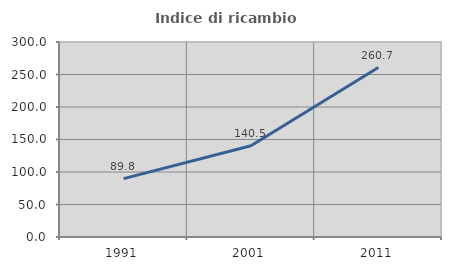
| Category | Indice di ricambio occupazionale  |
|---|---|
| 1991.0 | 89.762 |
| 2001.0 | 140.455 |
| 2011.0 | 260.665 |